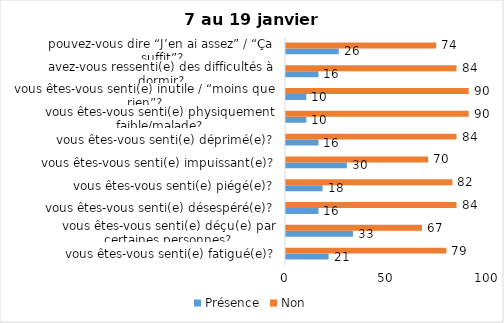
| Category | Présence | Non |
|---|---|---|
| vous êtes-vous senti(e) fatigué(e)? | 21 | 79 |
| vous êtes-vous senti(e) déçu(e) par certaines personnes? | 33 | 67 |
| vous êtes-vous senti(e) désespéré(e)? | 16 | 84 |
| vous êtes-vous senti(e) piégé(e)? | 18 | 82 |
| vous êtes-vous senti(e) impuissant(e)? | 30 | 70 |
| vous êtes-vous senti(e) déprimé(e)? | 16 | 84 |
| vous êtes-vous senti(e) physiquement faible/malade? | 10 | 90 |
| vous êtes-vous senti(e) inutile / “moins que rien”? | 10 | 90 |
| avez-vous ressenti(e) des difficultés à dormir? | 16 | 84 |
| pouvez-vous dire “J’en ai assez” / “Ça suffit”? | 26 | 74 |